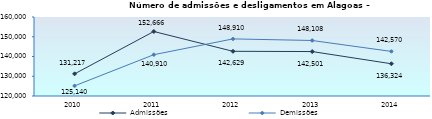
| Category | Admissões | Demissões |
|---|---|---|
| 2010.0 | 131217 | 125140 |
| 2011.0 | 152666 | 140910 |
| 2012.0 | 142629 | 148910 |
| 2013.0 | 142501 | 148108 |
| 2014.0 | 136324 | 142570 |